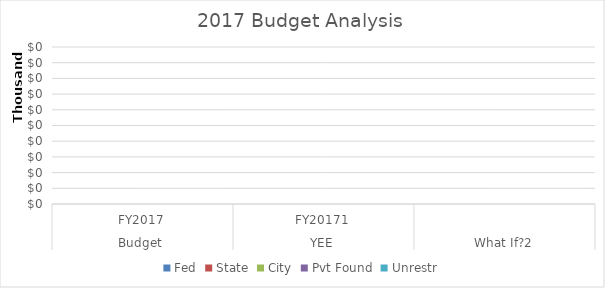
| Category | Fed | State | City | Pvt Found | Unrestr |
|---|---|---|---|---|---|
| 0 | 0 | 0 | 0 | 0 | 0 |
| 1 | 0 | 0 | 0 | 0 | 0 |
| 2 | 0 | 0 | 0 | 0 | 0 |